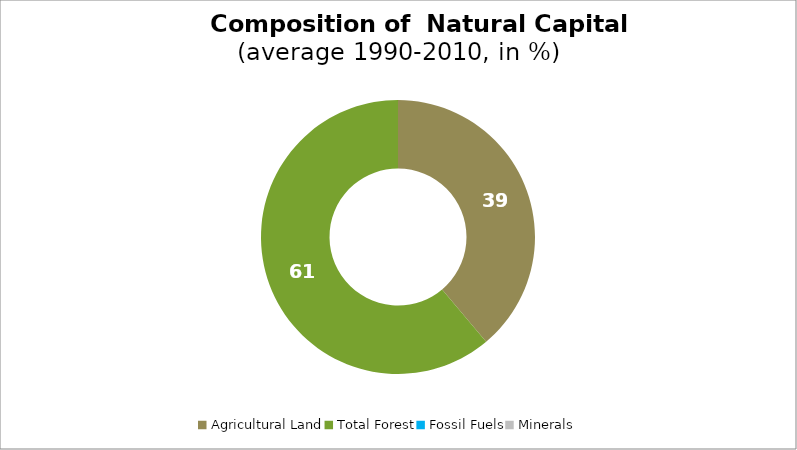
| Category | Series 0 |
|---|---|
| Agricultural Land | 38.873 |
| Total Forest | 61.127 |
| Fossil Fuels | 0 |
| Minerals | 0 |